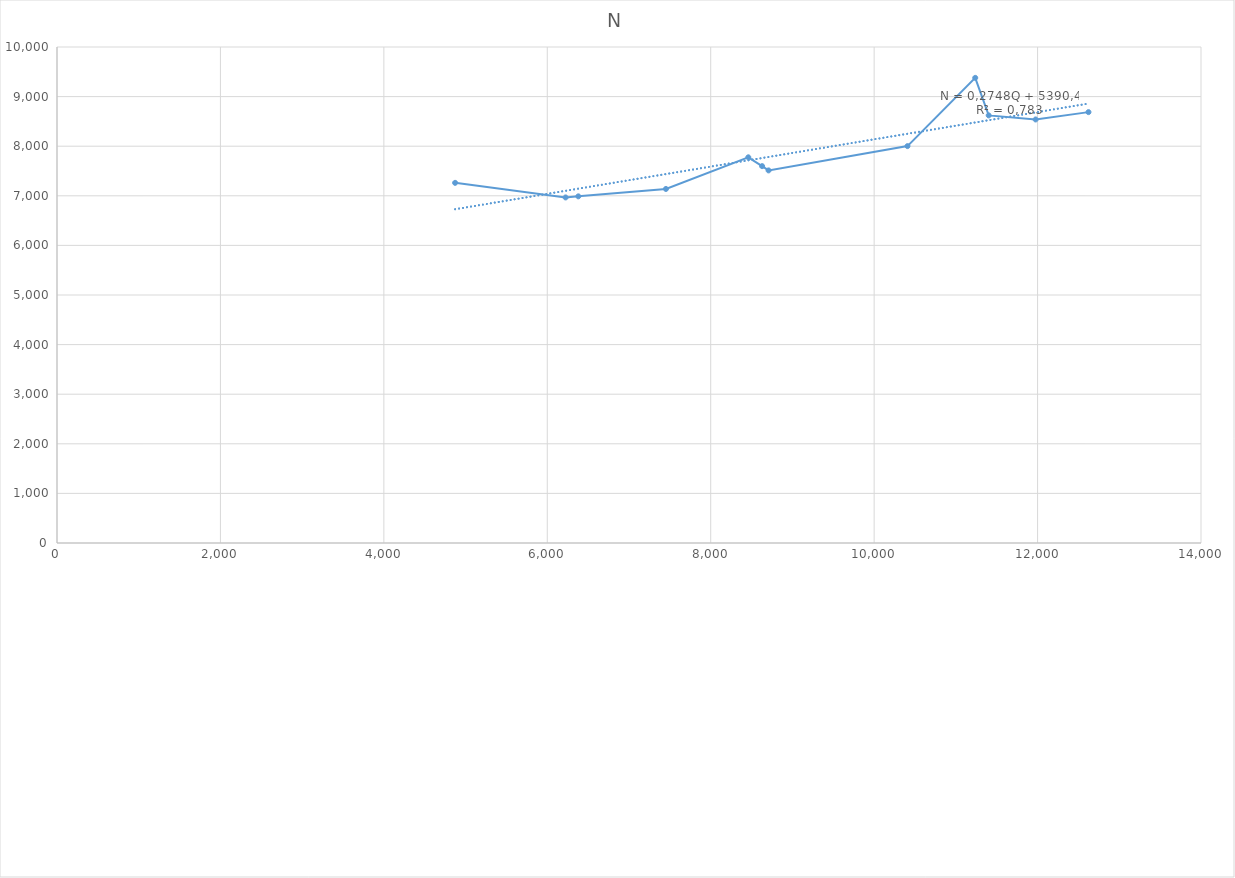
| Category | N |
|---|---|
| 4872.0 | 7261 |
| 6224.0 | 6967 |
| 6380.0 | 6989 |
| 7452.0 | 7138 |
| 8460.0 | 7776 |
| 8629.0 | 7598 |
| 8708.0 | 7512 |
| 10408.0 | 8002 |
| 11237.0 | 9378 |
| 11402.0 | 8621 |
| 11976.0 | 8539 |
| 12623.0 | 8687 |